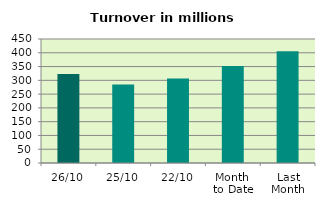
| Category | Series 0 |
|---|---|
| 26/10 | 323.432 |
| 25/10 | 284.929 |
| 22/10 | 306.401 |
| Month 
to Date | 352.352 |
| Last
Month | 405.806 |